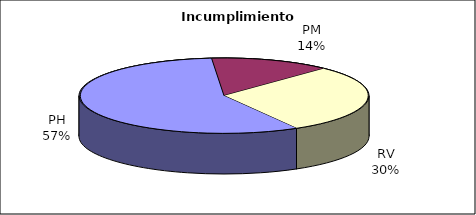
| Category | Valores |
|---|---|
| PH | 270 |
| PM | 64 |
| RV | 140 |